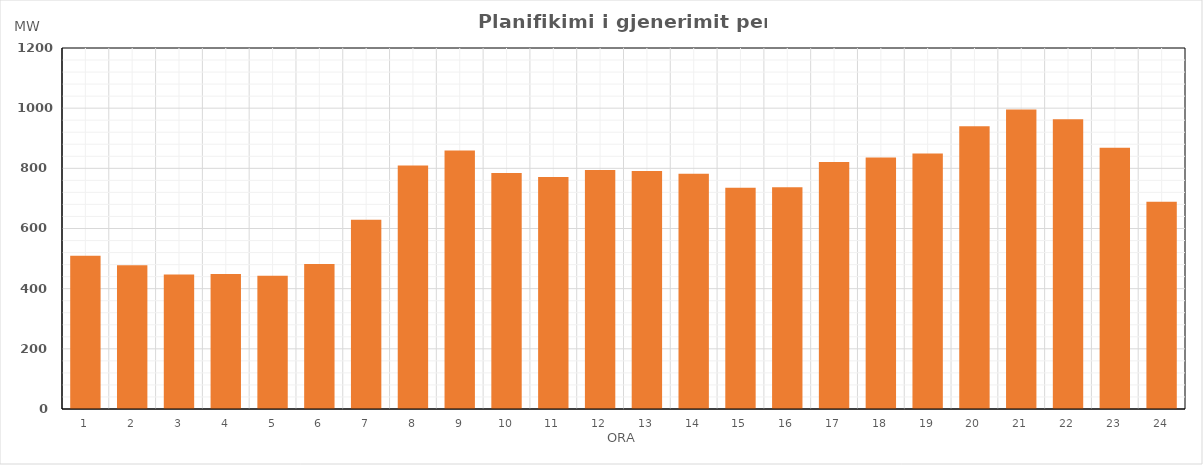
| Category | Max (MW) |
|---|---|
| 0 | 509.58 |
| 1 | 477.64 |
| 2 | 447.14 |
| 3 | 448.54 |
| 4 | 442.74 |
| 5 | 482.31 |
| 6 | 629.26 |
| 7 | 809.13 |
| 8 | 858.98 |
| 9 | 784.15 |
| 10 | 770.9 |
| 11 | 794.23 |
| 12 | 791.25 |
| 13 | 781.75 |
| 14 | 735.86 |
| 15 | 736.72 |
| 16 | 820.95 |
| 17 | 836.35 |
| 18 | 849.26 |
| 19 | 940.18 |
| 20 | 995.45 |
| 21 | 963.38 |
| 22 | 868.79 |
| 23 | 688.69 |